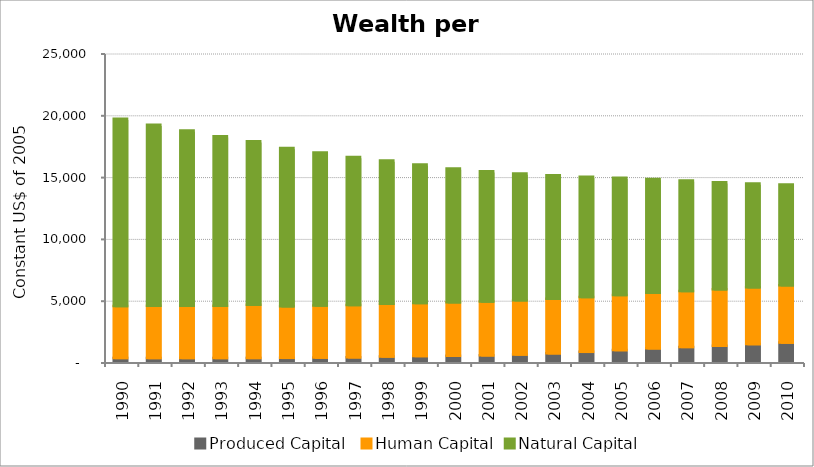
| Category | Produced Capital  | Human Capital | Natural Capital |
|---|---|---|---|
| 1990.0 | 310.785 | 4207.186 | 15133.312 |
| 1991.0 | 305.765 | 4216.771 | 14651.263 |
| 1992.0 | 307.238 | 4225.655 | 14171.683 |
| 1993.0 | 307.744 | 4232.869 | 13699.697 |
| 1994.0 | 312.196 | 4295.705 | 13241.724 |
| 1995.0 | 316.546 | 4179.501 | 12801.506 |
| 1996.0 | 335.676 | 4213.576 | 12377.613 |
| 1997.0 | 359.895 | 4240.288 | 11968.231 |
| 1998.0 | 429.758 | 4269.088 | 11574.791 |
| 1999.0 | 461.411 | 4298.975 | 11194.542 |
| 2000.0 | 483.451 | 4329.053 | 10823.231 |
| 2001.0 | 518.058 | 4352.3 | 10541.251 |
| 2002.0 | 589.273 | 4378.293 | 10270.032 |
| 2003.0 | 685.295 | 4406.226 | 10004.869 |
| 2004.0 | 804.787 | 4435.317 | 9737.59 |
| 2005.0 | 943.465 | 4464.576 | 9470.293 |
| 2006.0 | 1085.578 | 4494.634 | 9201.248 |
| 2007.0 | 1200.714 | 4527.8 | 8928.954 |
| 2008.0 | 1303.101 | 4562.585 | 8661.303 |
| 2009.0 | 1429.22 | 4597.355 | 8402.14 |
| 2010.0 | 1549.191 | 4631.035 | 8151.937 |